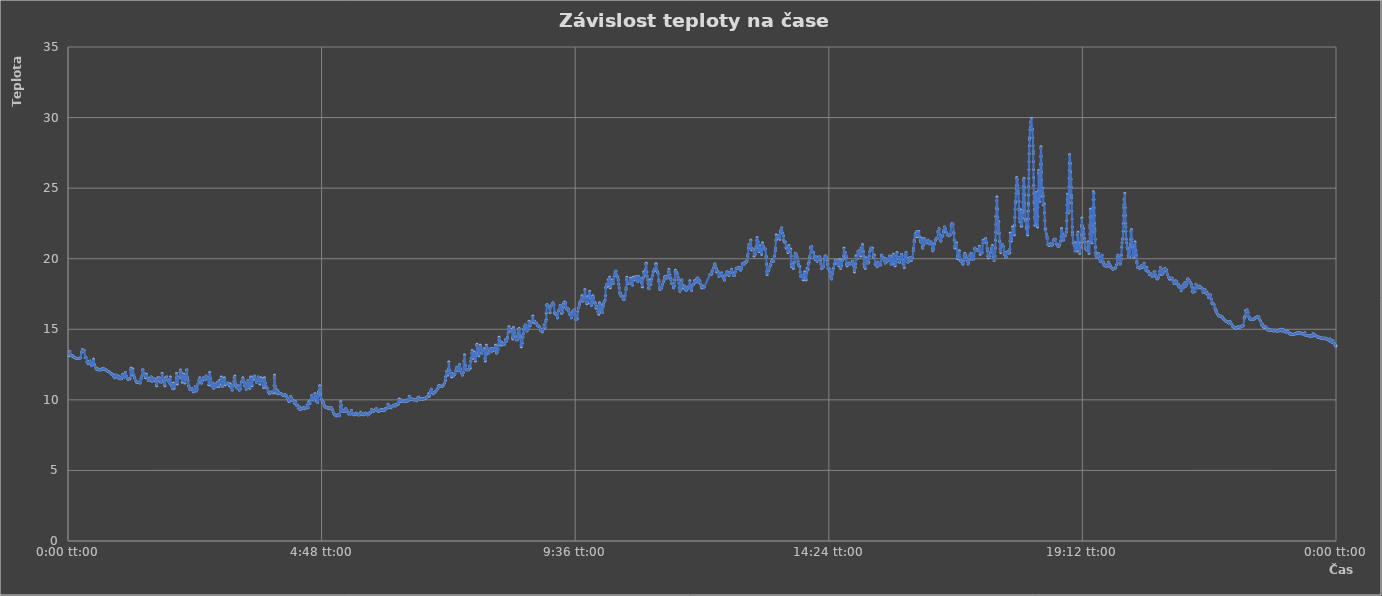
| Category | teplota |
|---|---|
| 0.000636574074074074 | 13.125 |
| 0.0013541666666666667 | 13.438 |
| 0.0020601851851851853 | 13.188 |
| 0.0028124999999999995 | 13.125 |
| 0.0035185185185185185 | 13.125 |
| 0.004236111111111111 | 13.062 |
| 0.004942129629629629 | 13 |
| 0.005659722222222222 | 13 |
| 0.00636574074074074 | 12.938 |
| 0.007083333333333333 | 12.938 |
| 0.0078009259259259256 | 12.938 |
| 0.008506944444444444 | 12.938 |
| 0.009224537037037036 | 12.938 |
| 0.009930555555555555 | 13 |
| 0.01064814814814815 | 13.375 |
| 0.011354166666666667 | 13.562 |
| 0.01207175925925926 | 13.438 |
| 0.012777777777777777 | 13.5 |
| 0.013587962962962963 | 13 |
| 0.014293981481481482 | 13 |
| 0.01511574074074074 | 12.688 |
| 0.015173611111111112 | 12.688 |
| 0.01587962962962963 | 12.562 |
| 0.01659722222222222 | 12.688 |
| 0.01730324074074074 | 12.75 |
| 0.018020833333333333 | 12.562 |
| 0.018726851851851852 | 12.438 |
| 0.019444444444444445 | 12.5 |
| 0.020150462962962964 | 12.875 |
| 0.020868055555555556 | 12.5 |
| 0.021574074074074075 | 12.312 |
| 0.022291666666666668 | 12.188 |
| 0.022997685185185187 | 12.188 |
| 0.023715277777777776 | 12.188 |
| 0.023877314814814813 | 12.125 |
| 0.024444444444444446 | 12.125 |
| 0.02515046296296296 | 12.125 |
| 0.025868055555555557 | 12.125 |
| 0.026574074074074073 | 12.188 |
| 0.027291666666666662 | 12.188 |
| 0.027997685185185184 | 12.188 |
| 0.02871527777777778 | 12.188 |
| 0.029421296296296296 | 12.125 |
| 0.030138888888888885 | 12.125 |
| 0.030844907407407404 | 12.062 |
| 0.0315625 | 12 |
| 0.03228009259259259 | 12 |
| 0.03298611111111111 | 11.938 |
| 0.0337037037037037 | 11.875 |
| 0.034409722222222223 | 11.812 |
| 0.03512731481481481 | 11.812 |
| 0.035833333333333335 | 11.688 |
| 0.036550925925925924 | 11.625 |
| 0.03699074074074074 | 11.562 |
| 0.037280092592592594 | 11.75 |
| 0.037986111111111116 | 11.75 |
| 0.038703703703703705 | 11.625 |
| 0.03940972222222222 | 11.688 |
| 0.04012731481481482 | 11.5 |
| 0.04083333333333333 | 11.625 |
| 0.041608796296296297 | 11.5 |
| 0.04232638888888889 | 11.5 |
| 0.043101851851851856 | 11.812 |
| 0.043819444444444446 | 11.625 |
| 0.04452546296296297 | 11.625 |
| 0.04524305555555556 | 11.938 |
| 0.04594907407407408 | 11.688 |
| 0.046863425925925926 | 11.5 |
| 0.047581018518518516 | 11.438 |
| 0.04828703703703704 | 11.5 |
| 0.04900462962962963 | 11.5 |
| 0.049479166666666664 | 12.125 |
| 0.0497337962962963 | 12.25 |
| 0.05043981481481482 | 11.75 |
| 0.05115740740740741 | 12.188 |
| 0.05186342592592593 | 11.75 |
| 0.052453703703703704 | 11.562 |
| 0.05259259259259259 | 11.562 |
| 0.05331018518518518 | 11.375 |
| 0.05401620370370371 | 11.25 |
| 0.054733796296296294 | 11.25 |
| 0.05543981481481481 | 11.25 |
| 0.056157407407407406 | 11.25 |
| 0.05686342592592592 | 11.188 |
| 0.05758101851851852 | 11.5 |
| 0.058298611111111114 | 11.688 |
| 0.05894675925925926 | 12.125 |
| 0.0590162037037037 | 12.125 |
| 0.0597337962962963 | 11.875 |
| 0.060439814814814814 | 11.812 |
| 0.06115740740740741 | 11.625 |
| 0.06116898148148148 | 11.562 |
| 0.06188657407407407 | 11.812 |
| 0.06259259259259259 | 11.562 |
| 0.06331018518518518 | 11.375 |
| 0.06422453703703704 | 11.375 |
| 0.06494212962962963 | 11.562 |
| 0.06564814814814814 | 11.625 |
| 0.06636574074074074 | 11.312 |
| 0.06707175925925926 | 11.375 |
| 0.06778935185185185 | 11.5 |
| 0.06849537037037036 | 11.438 |
| 0.06921296296296296 | 11.312 |
| 0.06991898148148147 | 11.062 |
| 0.06999999999999999 | 11 |
| 0.07064814814814814 | 11.375 |
| 0.07079861111111112 | 11.562 |
| 0.07137731481481481 | 11.375 |
| 0.07209490740740741 | 11.562 |
| 0.07280092592592592 | 11.25 |
| 0.07351851851851852 | 11.25 |
| 0.07422453703703703 | 11.875 |
| 0.07494212962962964 | 11.375 |
| 0.07564814814814814 | 11.25 |
| 0.07636574074074075 | 11.062 |
| 0.07644675925925926 | 11 |
| 0.07674768518518518 | 11.562 |
| 0.07710648148148148 | 11.438 |
| 0.07781249999999999 | 11.625 |
| 0.07858796296296296 | 11.438 |
| 0.07930555555555556 | 11.312 |
| 0.08002314814814815 | 11.188 |
| 0.08072916666666667 | 11.625 |
| 0.08144675925925926 | 11.062 |
| 0.08155092592592593 | 11 |
| 0.08229166666666667 | 10.812 |
| 0.08299768518518519 | 11.188 |
| 0.08371527777777778 | 10.812 |
| 0.08465277777777779 | 11.125 |
| 0.0853587962962963 | 11.562 |
| 0.08555555555555555 | 11.875 |
| 0.08626157407407407 | 11.125 |
| 0.08704861111111112 | 11.625 |
| 0.08775462962962964 | 11.562 |
| 0.08847222222222223 | 11.938 |
| 0.08877314814814814 | 12.125 |
| 0.08928240740740741 | 11.938 |
| 0.08951388888888889 | 11.562 |
| 0.09004629629629629 | 11.25 |
| 0.09079861111111111 | 11.625 |
| 0.09151620370370371 | 11.812 |
| 0.09222222222222222 | 11.188 |
| 0.09293981481481482 | 11.5 |
| 0.09359953703703704 | 12.125 |
| 0.09365740740740741 | 12.125 |
| 0.09424768518518518 | 11.562 |
| 0.09462962962962962 | 11.375 |
| 0.09521990740740742 | 11 |
| 0.09535879629629629 | 10.938 |
| 0.09606481481481481 | 10.75 |
| 0.09679398148148148 | 10.812 |
| 0.09749999999999999 | 10.812 |
| 0.09821759259259259 | 10.688 |
| 0.09893518518518518 | 10.562 |
| 0.0996412037037037 | 10.688 |
| 0.1003587962962963 | 10.938 |
| 0.10106481481481482 | 10.625 |
| 0.1017824074074074 | 10.75 |
| 0.10248842592592593 | 11.125 |
| 0.10320601851851852 | 11.375 |
| 0.10391203703703704 | 11.438 |
| 0.10399305555555556 | 11.562 |
| 0.10464120370370371 | 11.25 |
| 0.1053587962962963 | 11.188 |
| 0.10606481481481482 | 11.375 |
| 0.10678240740740741 | 11.562 |
| 0.10748842592592593 | 11.5 |
| 0.10820601851851852 | 11.438 |
| 0.10891203703703704 | 11.688 |
| 0.10962962962962963 | 11.562 |
| 0.11033564814814815 | 11.562 |
| 0.11105324074074074 | 11.062 |
| 0.11175925925925927 | 11.938 |
| 0.11247685185185186 | 11.5 |
| 0.11313657407407407 | 11 |
| 0.11340277777777778 | 11 |
| 0.11421296296296296 | 11.188 |
| 0.11493055555555555 | 10.812 |
| 0.11563657407407407 | 11 |
| 0.11653935185185187 | 11.125 |
| 0.11725694444444446 | 10.938 |
| 0.11809027777777777 | 11.25 |
| 0.11879629629629629 | 10.938 |
| 0.11951388888888888 | 11.375 |
| 0.1202199074074074 | 11.125 |
| 0.1208449074074074 | 11.562 |
| 0.12094907407407407 | 11.625 |
| 0.12155092592592592 | 11 |
| 0.12167824074074074 | 10.938 |
| 0.12253472222222223 | 11.25 |
| 0.12324074074074075 | 11.438 |
| 0.12331018518518518 | 11.562 |
| 0.12414351851851851 | 11.062 |
| 0.1248611111111111 | 11.188 |
| 0.12577546296296296 | 11.188 |
| 0.12649305555555554 | 11.125 |
| 0.12730324074074076 | 11.125 |
| 0.1273263888888889 | 11 |
| 0.1280324074074074 | 11.125 |
| 0.12875 | 10.875 |
| 0.1294560185185185 | 10.688 |
| 0.13017361111111111 | 11 |
| 0.13087962962962962 | 11.312 |
| 0.1310300925925926 | 11.562 |
| 0.1316087962962963 | 11.688 |
| 0.1323263888888889 | 11.125 |
| 0.13238425925925926 | 11 |
| 0.13304398148148147 | 10.875 |
| 0.13376157407407407 | 10.812 |
| 0.13446759259259258 | 11 |
| 0.13518518518518519 | 10.688 |
| 0.1359027777777778 | 10.75 |
| 0.1366087962962963 | 11.25 |
| 0.1373263888888889 | 11.312 |
| 0.13792824074074075 | 11.562 |
| 0.13804398148148148 | 11.438 |
| 0.13876157407407408 | 11.25 |
| 0.13925925925925928 | 11 |
| 0.13961805555555554 | 11.188 |
| 0.14050925925925925 | 10.75 |
| 0.14122685185185185 | 10.938 |
| 0.14193287037037036 | 11.375 |
| 0.14265046296296297 | 11.188 |
| 0.14335648148148147 | 10.812 |
| 0.14396990740740742 | 11.562 |
| 0.14423611111111112 | 11.625 |
| 0.14494212962962963 | 11.062 |
| 0.14510416666666667 | 11 |
| 0.1456712962962963 | 11.438 |
| 0.14574074074074075 | 11.562 |
| 0.14640046296296297 | 11.625 |
| 0.14710648148148148 | 11.688 |
| 0.14782407407407408 | 11.438 |
| 0.1485300925925926 | 11.25 |
| 0.1492476851851852 | 11.312 |
| 0.1499537037037037 | 11.625 |
| 0.1506712962962963 | 11.5 |
| 0.15138888888888888 | 11.125 |
| 0.15209490740740741 | 11.562 |
| 0.1528125 | 11.375 |
| 0.15351851851851853 | 11.5 |
| 0.15409722222222222 | 11 |
| 0.1542476851851852 | 10.875 |
| 0.1549537037037037 | 11.5 |
| 0.15497685185185187 | 11.562 |
| 0.15568287037037037 | 11.188 |
| 0.15582175925925926 | 11 |
| 0.15641203703703704 | 10.875 |
| 0.15711805555555555 | 10.812 |
| 0.15783564814814813 | 10.562 |
| 0.15855324074074076 | 10.562 |
| 0.15885416666666666 | 10.438 |
| 0.15927083333333333 | 10.5 |
| 0.1599884259259259 | 10.5 |
| 0.16069444444444445 | 10.562 |
| 0.16141203703703702 | 10.5 |
| 0.16212962962962962 | 10.5 |
| 0.16253472222222223 | 11 |
| 0.1627199074074074 | 11.562 |
| 0.1628587962962963 | 11.75 |
| 0.16333333333333333 | 11 |
| 0.16358796296296296 | 10.812 |
| 0.16430555555555557 | 10.5 |
| 0.16501157407407407 | 10.688 |
| 0.1654861111111111 | 10.438 |
| 0.16582175925925927 | 10.562 |
| 0.16653935185185184 | 10.5 |
| 0.16724537037037038 | 10.438 |
| 0.16796296296296298 | 10.438 |
| 0.16886574074074076 | 10.375 |
| 0.16957175925925927 | 10.312 |
| 0.17028935185185187 | 10.312 |
| 0.17121527777777779 | 10.375 |
| 0.1719328703703704 | 10.312 |
| 0.1726388888888889 | 10.188 |
| 0.1733564814814815 | 10.062 |
| 0.1740625 | 9.938 |
| 0.1743634259259259 | 9.875 |
| 0.17488425925925924 | 9.938 |
| 0.1756712962962963 | 10.25 |
| 0.1763773148148148 | 10.125 |
| 0.1770949074074074 | 9.938 |
| 0.1778125 | 9.938 |
| 0.17862268518518518 | 9.75 |
| 0.1794097222222222 | 9.875 |
| 0.18013888888888888 | 9.625 |
| 0.18085648148148148 | 9.625 |
| 0.1815625 | 9.438 |
| 0.18241898148148147 | 9.5 |
| 0.18291666666666664 | 9.312 |
| 0.18322916666666667 | 9.312 |
| 0.18395833333333333 | 9.375 |
| 0.18466435185185184 | 9.375 |
| 0.18538194444444445 | 9.438 |
| 0.18608796296296296 | 9.438 |
| 0.18680555555555556 | 9.375 |
| 0.18774305555555557 | 9.438 |
| 0.1886111111111111 | 9.625 |
| 0.18931712962962963 | 9.438 |
| 0.1900347222222222 | 9.812 |
| 0.19006944444444443 | 9.875 |
| 0.19076388888888887 | 9.75 |
| 0.1914699074074074 | 10 |
| 0.19218749999999998 | 10.312 |
| 0.19289351851851852 | 10.125 |
| 0.1936111111111111 | 10 |
| 0.19431712962962963 | 10 |
| 0.19475694444444444 | 10.438 |
| 0.19508101851851853 | 10.25 |
| 0.1958564814814815 | 10.188 |
| 0.19621527777777778 | 9.875 |
| 0.19680555555555557 | 9.812 |
| 0.19753472222222224 | 10.438 |
| 0.19756944444444446 | 10.562 |
| 0.19827546296296297 | 10.688 |
| 0.19847222222222224 | 11 |
| 0.1989699074074074 | 10.438 |
| 0.19908564814814814 | 10.312 |
| 0.19980324074074074 | 10.062 |
| 0.20050925925925925 | 9.938 |
| 0.2010300925925926 | 9.875 |
| 0.20123842592592592 | 9.812 |
| 0.20195601851851852 | 9.625 |
| 0.20266203703703703 | 9.5 |
| 0.20337962962962963 | 9.5 |
| 0.20409722222222224 | 9.438 |
| 0.20480324074074074 | 9.438 |
| 0.20552083333333335 | 9.375 |
| 0.20622685185185186 | 9.438 |
| 0.20694444444444446 | 9.375 |
| 0.20765046296296297 | 9.438 |
| 0.20831018518518518 | 9.312 |
| 0.20837962962962964 | 9.312 |
| 0.20909722222222224 | 9.125 |
| 0.20980324074074075 | 9 |
| 0.21052083333333335 | 8.938 |
| 0.21122685185185186 | 8.875 |
| 0.21194444444444446 | 8.875 |
| 0.21265046296296297 | 8.938 |
| 0.21336805555555557 | 8.938 |
| 0.21408564814814815 | 8.875 |
| 0.2147916666666667 | 9.5 |
| 0.21505787037037039 | 9.875 |
| 0.21552083333333336 | 9.625 |
| 0.21604166666666666 | 9.312 |
| 0.21625000000000003 | 9.188 |
| 0.2169675925925926 | 9.25 |
| 0.21768518518518518 | 9.188 |
| 0.21839120370370368 | 9.188 |
| 0.21910879629629632 | 9.375 |
| 0.21996527777777777 | 9.25 |
| 0.2206712962962963 | 9.125 |
| 0.22138888888888889 | 9 |
| 0.22209490740740742 | 9.062 |
| 0.2228125 | 9 |
| 0.22351851851851853 | 9.25 |
| 0.2242361111111111 | 9 |
| 0.22494212962962964 | 9 |
| 0.22565972222222222 | 8.938 |
| 0.22653935185185184 | 9 |
| 0.22724537037037038 | 9.062 |
| 0.22796296296296295 | 9 |
| 0.22868055555555555 | 8.938 |
| 0.22938657407407406 | 8.938 |
| 0.23010416666666667 | 8.938 |
| 0.23081018518518517 | 9.125 |
| 0.23152777777777778 | 9 |
| 0.23223379629629629 | 9 |
| 0.2330671296296296 | 8.938 |
| 0.23378472222222224 | 9 |
| 0.23449074074074075 | 9.062 |
| 0.23520833333333332 | 9 |
| 0.23592592592592596 | 8.938 |
| 0.23663194444444446 | 8.938 |
| 0.237349537037037 | 9.062 |
| 0.23805555555555555 | 9.062 |
| 0.23877314814814818 | 9.125 |
| 0.2394791666666667 | 9.312 |
| 0.24019675925925923 | 9.188 |
| 0.24100694444444445 | 9.188 |
| 0.24172453703703703 | 9.25 |
| 0.24243055555555557 | 9.312 |
| 0.24314814814814814 | 9.375 |
| 0.24386574074074074 | 9.25 |
| 0.24457175925925925 | 9.188 |
| 0.24528935185185186 | 9.188 |
| 0.24599537037037036 | 9.25 |
| 0.24673611111111113 | 9.312 |
| 0.24744212962962964 | 9.25 |
| 0.24815972222222224 | 9.312 |
| 0.24886574074074075 | 9.25 |
| 0.24958333333333335 | 9.25 |
| 0.25030092592592595 | 9.375 |
| 0.25100694444444444 | 9.375 |
| 0.25172453703703707 | 9.438 |
| 0.25243055555555555 | 9.688 |
| 0.2531481481481482 | 9.5 |
| 0.25385416666666666 | 9.5 |
| 0.2545717592592593 | 9.438 |
| 0.25527777777777777 | 9.5 |
| 0.2559953703703704 | 9.562 |
| 0.256712962962963 | 9.625 |
| 0.2574189814814815 | 9.625 |
| 0.2581365740740741 | 9.562 |
| 0.2588425925925926 | 9.688 |
| 0.25971064814814815 | 9.688 |
| 0.2604166666666667 | 9.688 |
| 0.2609837962962963 | 9.875 |
| 0.26114583333333335 | 10.062 |
| 0.26186342592592593 | 9.875 |
| 0.26256944444444447 | 10 |
| 0.26328703703703704 | 9.875 |
| 0.2639930555555556 | 9.875 |
| 0.26471064814814815 | 9.875 |
| 0.2654166666666667 | 9.938 |
| 0.26613425925925926 | 9.875 |
| 0.26685185185185184 | 9.875 |
| 0.2675578703703704 | 10 |
| 0.26841435185185186 | 9.938 |
| 0.26912037037037034 | 10.25 |
| 0.269837962962963 | 10.062 |
| 0.27054398148148145 | 10.062 |
| 0.2713541666666667 | 10.062 |
| 0.2720601851851852 | 10 |
| 0.2727777777777778 | 10 |
| 0.2734837962962963 | 10 |
| 0.2742013888888889 | 10 |
| 0.27490740740740743 | 9.938 |
| 0.27572916666666664 | 10.125 |
| 0.27644675925925927 | 10.188 |
| 0.27715277777777775 | 10.062 |
| 0.2778703703703704 | 10.062 |
| 0.27858796296296295 | 10.062 |
| 0.2792939814814815 | 10.062 |
| 0.28001157407407407 | 10.062 |
| 0.2807175925925926 | 10.062 |
| 0.2814351851851852 | 10.125 |
| 0.2821412037037037 | 10.125 |
| 0.2828587962962963 | 10.188 |
| 0.2835648148148148 | 10.25 |
| 0.2844675925925926 | 10.25 |
| 0.2845023148148148 | 10.438 |
| 0.28519675925925925 | 10.312 |
| 0.2859027777777778 | 10.625 |
| 0.28662037037037036 | 10.75 |
| 0.2873263888888889 | 10.5 |
| 0.28804398148148147 | 10.438 |
| 0.2887962962962963 | 10.5 |
| 0.2895138888888889 | 10.562 |
| 0.2902199074074074 | 10.625 |
| 0.291099537037037 | 10.75 |
| 0.29181712962962963 | 10.812 |
| 0.2924189814814815 | 11 |
| 0.2925462962962963 | 11 |
| 0.2932523148148148 | 11 |
| 0.29408564814814814 | 10.938 |
| 0.2947916666666667 | 10.938 |
| 0.29550925925925925 | 11 |
| 0.2962268518518519 | 11.062 |
| 0.29701388888888886 | 11.188 |
| 0.2977199074074074 | 11.375 |
| 0.29780092592592594 | 11.625 |
| 0.2986111111111111 | 12 |
| 0.29954861111111114 | 11.75 |
| 0.3001157407407407 | 12.188 |
| 0.30028935185185185 | 12.688 |
| 0.301099537037037 | 12.062 |
| 0.3019212962962963 | 11.875 |
| 0.3025347222222222 | 11.625 |
| 0.3029282407407407 | 11.875 |
| 0.30364583333333334 | 11.688 |
| 0.3043518518518518 | 11.75 |
| 0.3051273148148148 | 11.812 |
| 0.3058449074074074 | 12.062 |
| 0.30637731481481484 | 12.188 |
| 0.30667824074074074 | 12.312 |
| 0.30739583333333337 | 12.25 |
| 0.30810185185185185 | 12.062 |
| 0.30885416666666665 | 12.5 |
| 0.3095601851851852 | 12.188 |
| 0.31027777777777776 | 11.875 |
| 0.3110763888888889 | 11.75 |
| 0.3117824074074074 | 11.938 |
| 0.3122916666666667 | 12.75 |
| 0.3127314814814815 | 13.188 |
| 0.3134375 | 12.438 |
| 0.31376157407407407 | 12.188 |
| 0.31416666666666665 | 12.125 |
| 0.31506944444444446 | 12.125 |
| 0.3158564814814815 | 12.125 |
| 0.31657407407407406 | 12.375 |
| 0.3172800925925926 | 12.25 |
| 0.3176967592592593 | 12.75 |
| 0.31800925925925927 | 12.938 |
| 0.3185648148148148 | 13.312 |
| 0.31873842592592594 | 13.5 |
| 0.3196412037037037 | 12.938 |
| 0.3203472222222222 | 13.375 |
| 0.3210648148148148 | 13.062 |
| 0.32133101851851853 | 12.75 |
| 0.32178240740740743 | 13.188 |
| 0.3221527777777778 | 13.312 |
| 0.32244212962962965 | 13.875 |
| 0.32256944444444446 | 13.938 |
| 0.32328703703703704 | 13.625 |
| 0.3237152777777778 | 13.312 |
| 0.3240162037037037 | 13.125 |
| 0.3248263888888889 | 13.625 |
| 0.32511574074074073 | 13.875 |
| 0.32555555555555554 | 13.75 |
| 0.3262615740740741 | 13.312 |
| 0.3262847222222222 | 13.312 |
| 0.32719907407407406 | 13.5 |
| 0.32814814814814813 | 13.625 |
| 0.32885416666666667 | 12.938 |
| 0.32914351851851853 | 12.75 |
| 0.32958333333333334 | 13.188 |
| 0.3296064814814815 | 13.312 |
| 0.32993055555555556 | 13.875 |
| 0.3303935185185185 | 13.688 |
| 0.3305208333333333 | 13.312 |
| 0.3311226851851852 | 13.438 |
| 0.33184027777777775 | 13.312 |
| 0.3327199074074074 | 13.562 |
| 0.3334375 | 13.625 |
| 0.3341435185185185 | 13.438 |
| 0.3348611111111111 | 13.625 |
| 0.3355787037037037 | 13.5 |
| 0.3362847222222222 | 13.562 |
| 0.33700231481481485 | 13.688 |
| 0.33708333333333335 | 13.875 |
| 0.33771990740740737 | 13.5 |
| 0.3379861111111111 | 13.312 |
| 0.33844907407407404 | 13.375 |
| 0.33916666666666667 | 13.562 |
| 0.33945601851851853 | 13.875 |
| 0.33988425925925925 | 14.25 |
| 0.3399537037037037 | 14.438 |
| 0.3406134259259259 | 14.188 |
| 0.34133101851851855 | 14.062 |
| 0.34177083333333336 | 13.875 |
| 0.3420486111111111 | 14.062 |
| 0.34276620370370375 | 13.938 |
| 0.3434837962962963 | 14 |
| 0.3441898148148148 | 13.938 |
| 0.34490740740740744 | 14.25 |
| 0.345613425925926 | 14.125 |
| 0.3463310185185185 | 14.312 |
| 0.3465972222222222 | 14.438 |
| 0.3470486111111111 | 14.75 |
| 0.3476736111111111 | 15 |
| 0.3477777777777778 | 15.188 |
| 0.34849537037037037 | 14.875 |
| 0.3492013888888889 | 14.938 |
| 0.34991898148148143 | 15 |
| 0.35049768518518515 | 14.438 |
| 0.35063657407407406 | 14.312 |
| 0.3513078703703704 | 15 |
| 0.35136574074074073 | 15.125 |
| 0.3520833333333333 | 14.812 |
| 0.35278935185185184 | 14.5 |
| 0.3529166666666667 | 14.438 |
| 0.3535185185185185 | 14.25 |
| 0.35437500000000005 | 14.25 |
| 0.35508101851851853 | 14.688 |
| 0.3552662037037037 | 15 |
| 0.3558101851851852 | 15.062 |
| 0.3565509259259259 | 14.562 |
| 0.35662037037037037 | 14.438 |
| 0.35733796296296294 | 13.875 |
| 0.35747685185185185 | 13.75 |
| 0.3581828703703704 | 14 |
| 0.3587962962962963 | 14.438 |
| 0.3590625 | 14.688 |
| 0.3594212962962963 | 15 |
| 0.3599305555555556 | 15.188 |
| 0.36063657407407407 | 15.312 |
| 0.36135416666666664 | 15.125 |
| 0.3620601851851852 | 14.875 |
| 0.3627777777777778 | 15 |
| 0.36354166666666665 | 15.562 |
| 0.3637384259259259 | 15.25 |
| 0.36445601851851855 | 15.25 |
| 0.3651736111111111 | 15.438 |
| 0.3658796296296296 | 15.562 |
| 0.36658564814814815 | 15.938 |
| 0.3673032407407408 | 15.5 |
| 0.3680208333333333 | 15.562 |
| 0.36872685185185183 | 15.438 |
| 0.36944444444444446 | 15.438 |
| 0.370150462962963 | 15.25 |
| 0.3708680555555555 | 15.25 |
| 0.3717824074074074 | 15.188 |
| 0.3725347222222222 | 15 |
| 0.3726157407407407 | 14.938 |
| 0.37332175925925926 | 15 |
| 0.3740393518518519 | 14.812 |
| 0.37475694444444446 | 15 |
| 0.37546296296296294 | 15.312 |
| 0.3761805555555556 | 15.125 |
| 0.37680555555555556 | 15.562 |
| 0.3770949074074074 | 15.688 |
| 0.3771527777777777 | 16.125 |
| 0.3776157407407407 | 16.688 |
| 0.3778356481481482 | 16.75 |
| 0.37855324074074076 | 16.625 |
| 0.37942129629629634 | 16.562 |
| 0.3801273148148148 | 16.188 |
| 0.3808449074074074 | 16.625 |
| 0.381712962962963 | 16.75 |
| 0.38243055555555555 | 16.875 |
| 0.38313657407407403 | 16.75 |
| 0.38385416666666666 | 16.188 |
| 0.383900462962963 | 16.125 |
| 0.38457175925925924 | 16.062 |
| 0.38528935185185187 | 16.062 |
| 0.3859953703703704 | 15.812 |
| 0.38680555555555557 | 16.312 |
| 0.38751157407407405 | 16.438 |
| 0.3881365740740741 | 16.688 |
| 0.3882407407407407 | 16.688 |
| 0.38895833333333335 | 16.438 |
| 0.38925925925925925 | 16.125 |
| 0.38986111111111116 | 16.188 |
| 0.3907638888888889 | 16.562 |
| 0.39077546296296295 | 16.812 |
| 0.3916203703703704 | 16.938 |
| 0.3924652777777778 | 16.875 |
| 0.39326388888888886 | 16.438 |
| 0.3940277777777778 | 16.438 |
| 0.3947337962962963 | 16.438 |
| 0.3949768518518519 | 16.25 |
| 0.39556712962962964 | 16.062 |
| 0.3962847222222223 | 16.062 |
| 0.39699074074074076 | 15.812 |
| 0.39770833333333333 | 16.188 |
| 0.39841435185185187 | 16.312 |
| 0.3991319444444445 | 16.375 |
| 0.399837962962963 | 16 |
| 0.40047453703703706 | 15.688 |
| 0.4007986111111111 | 15.688 |
| 0.4016203703703704 | 15.75 |
| 0.402037037037037 | 16.25 |
| 0.40238425925925925 | 16.5 |
| 0.4031018518518519 | 16.688 |
| 0.4034143518518518 | 16.812 |
| 0.4039351851851852 | 16.938 |
| 0.40471064814814817 | 17.062 |
| 0.4052893518518519 | 17.375 |
| 0.40552083333333333 | 17.25 |
| 0.40622685185185187 | 17 |
| 0.4069444444444445 | 17.25 |
| 0.407650462962963 | 17.812 |
| 0.40836805555555555 | 17.312 |
| 0.4091898148148148 | 16.938 |
| 0.40925925925925927 | 16.812 |
| 0.4099189814814815 | 16.875 |
| 0.410625 | 17.312 |
| 0.41063657407407406 | 17.375 |
| 0.4113541666666667 | 17.688 |
| 0.4120601851851852 | 17.188 |
| 0.41239583333333335 | 16.812 |
| 0.4127893518518519 | 16.688 |
| 0.4134953703703704 | 17 |
| 0.41387731481481477 | 17.375 |
| 0.41422453703703704 | 17.25 |
| 0.4149421296296296 | 16.938 |
| 0.41564814814814816 | 16.875 |
| 0.4156828703703704 | 16.812 |
| 0.4163773148148148 | 16.5 |
| 0.4170833333333333 | 16.625 |
| 0.41780092592592594 | 16.5 |
| 0.4179629629629629 | 16.25 |
| 0.4185300925925926 | 16.062 |
| 0.419212962962963 | 16.812 |
| 0.4192476851851852 | 16.875 |
| 0.4199652777777778 | 16.75 |
| 0.42061342592592593 | 16.25 |
| 0.4206944444444444 | 16.188 |
| 0.421400462962963 | 16.188 |
| 0.42211805555555554 | 16.625 |
| 0.4223148148148148 | 16.812 |
| 0.4228356481481481 | 16.938 |
| 0.42355324074074074 | 17.062 |
| 0.4238888888888889 | 17.375 |
| 0.42416666666666664 | 17.938 |
| 0.42429398148148145 | 18 |
| 0.425 | 18.188 |
| 0.4257175925925926 | 18.062 |
| 0.4260300925925926 | 18.5 |
| 0.4264467592592593 | 18.375 |
| 0.42715277777777777 | 18.688 |
| 0.4276851851851852 | 17.938 |
| 0.42788194444444444 | 18.125 |
| 0.428587962962963 | 18.25 |
| 0.4287384259259259 | 18.5 |
| 0.42931712962962965 | 18.375 |
| 0.4300347222222222 | 18.25 |
| 0.4307407407407407 | 18.75 |
| 0.43145833333333333 | 18.938 |
| 0.43157407407407405 | 19.062 |
| 0.4321759259259259 | 19.125 |
| 0.43289351851851854 | 18.812 |
| 0.4335995370370371 | 18.688 |
| 0.43388888888888894 | 18.5 |
| 0.43432870370370374 | 18.188 |
| 0.4346643518518518 | 17.938 |
| 0.4350578703703704 | 17.562 |
| 0.4357638888888889 | 17.562 |
| 0.43615740740740744 | 17.375 |
| 0.43649305555555556 | 17.375 |
| 0.43721064814814814 | 17.312 |
| 0.4379166666666667 | 17.125 |
| 0.4386342592592593 | 17.125 |
| 0.4393402777777778 | 17.375 |
| 0.44005787037037036 | 17.812 |
| 0.440162037037037 | 17.938 |
| 0.4406481481481481 | 18.5 |
| 0.4407986111111111 | 18.688 |
| 0.44150462962962966 | 18.25 |
| 0.44222222222222224 | 18.25 |
| 0.4429282407407407 | 18.25 |
| 0.44364583333333335 | 18.625 |
| 0.4443518518518519 | 18.25 |
| 0.44506944444444446 | 18.125 |
| 0.44577546296296294 | 18.688 |
| 0.4464930555555556 | 18.5 |
| 0.4471990740740741 | 18.562 |
| 0.4479166666666667 | 18.75 |
| 0.44862268518518517 | 18.562 |
| 0.44934027777777774 | 18.375 |
| 0.45004629629629633 | 18.75 |
| 0.4507638888888889 | 18.5 |
| 0.4514699074074074 | 18.625 |
| 0.45218749999999996 | 18.312 |
| 0.4528935185185185 | 18 |
| 0.45361111111111113 | 18.625 |
| 0.45405092592592594 | 19.062 |
| 0.4545601851851852 | 18.812 |
| 0.4552777777777777 | 19.188 |
| 0.4558101851851852 | 19.625 |
| 0.4560069444444444 | 19.688 |
| 0.45643518518518517 | 19.062 |
| 0.456724537037037 | 18.75 |
| 0.45716435185185184 | 18.5 |
| 0.4574537037037037 | 18.25 |
| 0.45784722222222224 | 17.938 |
| 0.45818287037037037 | 17.875 |
| 0.4588888888888889 | 18.25 |
| 0.4590972222222222 | 18.5 |
| 0.45961805555555557 | 18.188 |
| 0.46033564814814815 | 18.562 |
| 0.4610416666666666 | 18.812 |
| 0.46142361111111113 | 19.062 |
| 0.4617708333333333 | 19.125 |
| 0.46247685185185183 | 19.25 |
| 0.46319444444444446 | 19.188 |
| 0.46350694444444446 | 19.625 |
| 0.46391203703703704 | 19.625 |
| 0.46462962962962967 | 19.125 |
| 0.46474537037037034 | 19.062 |
| 0.46535879629629634 | 18.938 |
| 0.4659259259259259 | 18.5 |
| 0.46607638888888886 | 18.375 |
| 0.4665972222222223 | 17.938 |
| 0.46680555555555553 | 17.812 |
| 0.46752314814814816 | 17.938 |
| 0.4682291666666667 | 17.938 |
| 0.46893518518518523 | 18.188 |
| 0.46965277777777775 | 18.375 |
| 0.47012731481481485 | 18.5 |
| 0.4703819444444444 | 18.688 |
| 0.47108796296296296 | 18.75 |
| 0.4718055555555556 | 18.688 |
| 0.4725115740740741 | 18.625 |
| 0.47322916666666665 | 18.812 |
| 0.4737384259259259 | 19.062 |
| 0.4739467592592593 | 19.25 |
| 0.47466435185185185 | 18.875 |
| 0.4753703703703704 | 18.625 |
| 0.4755671296296296 | 18.5 |
| 0.47609953703703706 | 18.25 |
| 0.4768171296296296 | 18.25 |
| 0.4775231481481481 | 18 |
| 0.4776157407407407 | 17.938 |
| 0.4782523148148148 | 18.062 |
| 0.47855324074074074 | 18.5 |
| 0.47879629629629633 | 19.062 |
| 0.47899305555555555 | 19.188 |
| 0.4796990740740741 | 19.062 |
| 0.48041666666666666 | 18.938 |
| 0.48112268518518514 | 18.688 |
| 0.48126157407407405 | 18.5 |
| 0.4818518518518518 | 18.25 |
| 0.4820717592592592 | 17.938 |
| 0.4825810185185185 | 17.688 |
| 0.483287037037037 | 17.812 |
| 0.48400462962962965 | 18.438 |
| 0.4840740740740741 | 18.5 |
| 0.4847337962962963 | 18.125 |
| 0.48483796296296294 | 17.938 |
| 0.4854513888888889 | 17.938 |
| 0.4861689814814815 | 18.062 |
| 0.486875 | 17.812 |
| 0.4875925925925926 | 17.75 |
| 0.4882986111111111 | 17.938 |
| 0.48901620370370374 | 17.875 |
| 0.4897222222222222 | 18.062 |
| 0.4904398148148148 | 18.438 |
| 0.49114583333333334 | 18 |
| 0.49186342592592597 | 17.75 |
| 0.49256944444444445 | 18.125 |
| 0.493287037037037 | 18.188 |
| 0.49399305555555556 | 18.438 |
| 0.4947106481481482 | 18.312 |
| 0.49541666666666667 | 18.438 |
| 0.49570601851851853 | 18.5 |
| 0.49614583333333334 | 18.625 |
| 0.4968518518518519 | 18.625 |
| 0.49756944444444445 | 18.312 |
| 0.49827546296296293 | 18.438 |
| 0.49899305555555556 | 18.188 |
| 0.4996990740740741 | 18.062 |
| 0.4998263888888889 | 17.938 |
| 0.5004282407407408 | 18.062 |
| 0.5011458333333333 | 17.938 |
| 0.5018518518518519 | 18 |
| 0.506261574074074 | 18.875 |
| 0.5069791666666666 | 18.875 |
| 0.5076851851851852 | 18.938 |
| 0.5078703703703703 | 19.062 |
| 0.5084143518518519 | 19.188 |
| 0.5091319444444444 | 19.375 |
| 0.5098379629629629 | 19.562 |
| 0.5101041666666667 | 19.625 |
| 0.5105671296296296 | 19.5 |
| 0.5112731481481482 | 19.312 |
| 0.511550925925926 | 19.062 |
| 0.5120023148148148 | 19.125 |
| 0.5127083333333333 | 19.062 |
| 0.513425925925926 | 18.75 |
| 0.5141319444444444 | 18.812 |
| 0.5148495370370371 | 18.938 |
| 0.5155671296296297 | 19 |
| 0.5162731481481482 | 18.75 |
| 0.5169791666666667 | 18.625 |
| 0.5176620370370371 | 18.5 |
| 0.5177083333333333 | 18.5 |
| 0.518425925925926 | 18.812 |
| 0.5191319444444444 | 18.875 |
| 0.5196759259259259 | 19.062 |
| 0.5198611111111111 | 19.062 |
| 0.5205671296296296 | 18.938 |
| 0.5212847222222222 | 18.812 |
| 0.5219907407407408 | 19 |
| 0.5227083333333333 | 19.062 |
| 0.5234143518518518 | 19.25 |
| 0.5241319444444444 | 19 |
| 0.524837962962963 | 18.812 |
| 0.5255555555555556 | 18.812 |
| 0.526261574074074 | 19.062 |
| 0.5269791666666667 | 19.312 |
| 0.5276851851851853 | 19.312 |
| 0.5284027777777778 | 19.375 |
| 0.5291087962962963 | 19.312 |
| 0.5298263888888889 | 19.375 |
| 0.5305324074074075 | 19.188 |
| 0.53125 | 19.312 |
| 0.5319328703703704 | 19.625 |
| 0.5319675925925925 | 19.625 |
| 0.5326851851851852 | 19.688 |
| 0.5333912037037037 | 19.625 |
| 0.5341087962962963 | 19.75 |
| 0.5348263888888889 | 19.75 |
| 0.5355324074074074 | 19.875 |
| 0.5360069444444444 | 20.188 |
| 0.536261574074074 | 20.312 |
| 0.5365740740740741 | 20.75 |
| 0.5369907407407407 | 21 |
| 0.5376967592592593 | 20.812 |
| 0.5384027777777778 | 21.312 |
| 0.538425925925926 | 21.312 |
| 0.5387384259259259 | 20.75 |
| 0.5391550925925926 | 20.625 |
| 0.5398611111111111 | 20.688 |
| 0.5405787037037036 | 20.625 |
| 0.5410416666666666 | 20.188 |
| 0.5412962962962963 | 20.25 |
| 0.5420138888888889 | 20.312 |
| 0.5425347222222222 | 20.75 |
| 0.5427430555555556 | 20.875 |
| 0.5432175925925926 | 21.312 |
| 0.5434606481481482 | 21.5 |
| 0.5441782407407407 | 21.188 |
| 0.5444444444444444 | 20.75 |
| 0.5449074074074074 | 20.5 |
| 0.5456134259259259 | 20.938 |
| 0.5463310185185185 | 20.5 |
| 0.5470370370370371 | 20.312 |
| 0.5477546296296296 | 21.125 |
| 0.5484606481481481 | 20.875 |
| 0.5491782407407407 | 20.688 |
| 0.5498958333333334 | 20.688 |
| 0.5505324074074074 | 20.188 |
| 0.550613425925926 | 20.125 |
| 0.5509027777777779 | 19.625 |
| 0.5511805555555556 | 19.062 |
| 0.5513541666666667 | 18.875 |
| 0.5520717592592593 | 19.125 |
| 0.5527777777777778 | 19.188 |
| 0.5534953703703703 | 19.438 |
| 0.5541435185185185 | 19.625 |
| 0.554224537037037 | 19.562 |
| 0.5549305555555556 | 19.812 |
| 0.5556481481481481 | 19.938 |
| 0.5563541666666666 | 19.812 |
| 0.557025462962963 | 20.188 |
| 0.5570833333333333 | 20.188 |
| 0.5577893518518519 | 20.562 |
| 0.5578587962962963 | 20.75 |
| 0.5583680555555556 | 21.312 |
| 0.5585300925925926 | 21.688 |
| 0.5592476851851852 | 21.438 |
| 0.5599537037037037 | 21.625 |
| 0.5606712962962963 | 21.5 |
| 0.5613888888888888 | 21.375 |
| 0.561886574074074 | 21.875 |
| 0.5621064814814815 | 22 |
| 0.5628240740740741 | 22.188 |
| 0.5635300925925926 | 21.812 |
| 0.5642476851851852 | 21.625 |
| 0.5644212962962963 | 21.312 |
| 0.5649768518518519 | 21.188 |
| 0.5656828703703703 | 21.188 |
| 0.5663657407407408 | 20.75 |
| 0.566412037037037 | 20.812 |
| 0.5671180555555556 | 20.75 |
| 0.5678356481481481 | 20.438 |
| 0.5685532407407408 | 20.938 |
| 0.5692592592592592 | 20.562 |
| 0.5699652777777778 | 20.688 |
| 0.5702893518518518 | 20.188 |
| 0.5705787037037037 | 19.625 |
| 0.5707060185185185 | 19.438 |
| 0.5714236111111112 | 19.625 |
| 0.5721296296296297 | 19.312 |
| 0.5728472222222222 | 19.75 |
| 0.573275462962963 | 20.188 |
| 0.5735763888888888 | 20.375 |
| 0.5742824074074074 | 20.312 |
| 0.5750000000000001 | 20.125 |
| 0.5757060185185185 | 19.812 |
| 0.5758912037037037 | 19.625 |
| 0.5764351851851852 | 19.5 |
| 0.5771412037037037 | 19.438 |
| 0.5774074074074075 | 19.062 |
| 0.5778703703703704 | 18.75 |
| 0.578576388888889 | 18.812 |
| 0.5792939814814815 | 18.812 |
| 0.5796990740740741 | 18.5 |
| 0.5800231481481481 | 18.625 |
| 0.5807291666666666 | 18.938 |
| 0.5809143518518519 | 19.062 |
| 0.5814583333333333 | 18.688 |
| 0.5815972222222222 | 18.5 |
| 0.5821875 | 18.5 |
| 0.5827083333333333 | 19.062 |
| 0.5829050925925926 | 19.312 |
| 0.5836226851851852 | 19.25 |
| 0.5838541666666667 | 19.625 |
| 0.5843518518518519 | 19.75 |
| 0.5850578703703704 | 20.062 |
| 0.5851041666666666 | 20.188 |
| 0.5857407407407408 | 20.75 |
| 0.5857986111111111 | 20.812 |
| 0.5865162037037037 | 20.875 |
| 0.5872222222222222 | 20.438 |
| 0.5879398148148148 | 20.438 |
| 0.5884490740740741 | 20.188 |
| 0.5886574074074075 | 20.062 |
| 0.589375 | 19.938 |
| 0.5900810185185185 | 20.125 |
| 0.5907986111111111 | 19.812 |
| 0.5915046296296297 | 20.062 |
| 0.5922222222222222 | 20.125 |
| 0.5929282407407407 | 20.125 |
| 0.5936458333333333 | 19.875 |
| 0.59375 | 19.625 |
| 0.594363425925926 | 19.312 |
| 0.5950810185185186 | 19.375 |
| 0.5957870370370371 | 19.438 |
| 0.5965046296296296 | 20 |
| 0.5971990740740741 | 20.188 |
| 0.5972337962962962 | 20.188 |
| 0.5979398148148148 | 20.125 |
| 0.5986574074074075 | 19.875 |
| 0.5988194444444445 | 19.625 |
| 0.599375 | 19.312 |
| 0.6000925925925926 | 19.25 |
| 0.6008101851851851 | 19.25 |
| 0.6011574074074074 | 19.062 |
| 0.6015277777777778 | 18.75 |
| 0.6022453703703704 | 18.562 |
| 0.6029513888888889 | 18.938 |
| 0.6036689814814815 | 19.312 |
| 0.6043287037037037 | 19.625 |
| 0.6043981481481482 | 19.625 |
| 0.6051041666666667 | 19.875 |
| 0.6058101851851853 | 19.875 |
| 0.6065277777777778 | 19.688 |
| 0.6072337962962963 | 19.875 |
| 0.6079513888888889 | 19.5 |
| 0.6086574074074075 | 19.938 |
| 0.609375 | 19.312 |
| 0.6100810185185185 | 19.5 |
| 0.6107986111111111 | 19.875 |
| 0.6115046296296297 | 20 |
| 0.6116435185185185 | 20.188 |
| 0.6119212962962963 | 20.75 |
| 0.6122453703703704 | 20.438 |
| 0.6129629629629629 | 20.438 |
| 0.6136226851851853 | 20.188 |
| 0.6136921296296296 | 20.062 |
| 0.6140162037037037 | 19.625 |
| 0.6144097222222222 | 19.5 |
| 0.6151273148148148 | 19.625 |
| 0.6158333333333333 | 19.688 |
| 0.616550925925926 | 19.625 |
| 0.6172569444444445 | 19.688 |
| 0.617974537037037 | 19.688 |
| 0.6186805555555556 | 19.812 |
| 0.6193981481481482 | 19.5 |
| 0.6201041666666667 | 19.188 |
| 0.6202083333333334 | 19.062 |
| 0.6208333333333333 | 19.375 |
| 0.6210532407407408 | 19.625 |
| 0.6215277777777778 | 20.188 |
| 0.6215740740740741 | 20.188 |
| 0.6222916666666667 | 20 |
| 0.6229976851851852 | 20.5 |
| 0.6237152777777778 | 20.562 |
| 0.6244212962962963 | 20.312 |
| 0.6251388888888889 | 20.188 |
| 0.6255671296296296 | 20.75 |
| 0.6258680555555556 | 20.75 |
| 0.6265740740740741 | 21 |
| 0.6272916666666667 | 20.5 |
| 0.6274652777777777 | 20.188 |
| 0.6277314814814815 | 19.625 |
| 0.6280208333333334 | 19.438 |
| 0.628738425925926 | 19.312 |
| 0.6294444444444445 | 20.062 |
| 0.630162037037037 | 19.812 |
| 0.6308680555555556 | 19.688 |
| 0.6315856481481482 | 19.75 |
| 0.631875 | 20.188 |
| 0.6323148148148149 | 20.5 |
| 0.6330208333333334 | 20.625 |
| 0.6332523148148148 | 20.75 |
| 0.63375 | 20.75 |
| 0.6344560185185185 | 20.75 |
| 0.6349768518518518 | 20.188 |
| 0.6351851851851852 | 20.125 |
| 0.6359027777777778 | 20.25 |
| 0.6366087962962963 | 19.625 |
| 0.6366203703703703 | 19.625 |
| 0.637337962962963 | 19.625 |
| 0.6380439814814814 | 19.438 |
| 0.6387615740740741 | 19.75 |
| 0.6394675925925926 | 19.562 |
| 0.6401851851851852 | 19.562 |
| 0.6408912037037037 | 19.562 |
| 0.6415509259259259 | 20.188 |
| 0.6416203703703703 | 20.25 |
| 0.6423263888888889 | 20.125 |
| 0.6430439814814815 | 20.062 |
| 0.6437499999999999 | 19.875 |
| 0.6444675925925926 | 19.688 |
| 0.6451736111111112 | 20 |
| 0.6458912037037037 | 19.812 |
| 0.6465972222222222 | 19.938 |
| 0.6473148148148148 | 19.875 |
| 0.6480208333333334 | 20.188 |
| 0.6487384259259259 | 19.938 |
| 0.6490972222222222 | 19.625 |
| 0.6494675925925926 | 19.625 |
| 0.650173611111111 | 20.125 |
| 0.6501851851851852 | 20.188 |
| 0.6509027777777777 | 20.312 |
| 0.6516087962962963 | 19.812 |
| 0.651724537037037 | 19.625 |
| 0.652337962962963 | 19.5 |
| 0.6530439814814815 | 19.75 |
| 0.6535185185185185 | 20.188 |
| 0.6537731481481481 | 20.438 |
| 0.6544907407407408 | 20 |
| 0.6551967592592592 | 20.062 |
| 0.6559143518518519 | 19.75 |
| 0.6566203703703704 | 20.062 |
| 0.657337962962963 | 20.312 |
| 0.6580439814814815 | 19.938 |
| 0.6587615740740741 | 19.688 |
| 0.6587731481481481 | 19.625 |
| 0.6594791666666667 | 19.375 |
| 0.660150462962963 | 20.188 |
| 0.6602083333333334 | 20.25 |
| 0.6609259259259259 | 20.438 |
| 0.6616319444444444 | 20.062 |
| 0.662349537037037 | 19.75 |
| 0.6630555555555556 | 19.812 |
| 0.6637731481481481 | 20.062 |
| 0.6644791666666666 | 20.062 |
| 0.6651851851851852 | 19.875 |
| 0.6659027777777778 | 20.062 |
| 0.6666087962962963 | 20.562 |
| 0.6668055555555555 | 20.75 |
| 0.667337962962963 | 21.188 |
| 0.6674305555555556 | 21.312 |
| 0.6680671296296296 | 21.75 |
| 0.6687847222222222 | 21.562 |
| 0.6691203703703703 | 21.875 |
| 0.6695023148148148 | 21.938 |
| 0.6702199074074073 | 21.562 |
| 0.670925925925926 | 21.938 |
| 0.6716435185185184 | 21.562 |
| 0.6721180555555555 | 21.312 |
| 0.6723611111111111 | 21.188 |
| 0.6730787037037037 | 21.438 |
| 0.6737962962962962 | 20.875 |
| 0.674074074074074 | 20.75 |
| 0.6745138888888889 | 20.938 |
| 0.6749884259259259 | 21.312 |
| 0.6752430555555556 | 21.438 |
| 0.6760185185185185 | 21.125 |
| 0.6768055555555555 | 21.125 |
| 0.6775578703703703 | 21.25 |
| 0.6782638888888889 | 21.312 |
| 0.6789930555555556 | 21.062 |
| 0.6797222222222222 | 21.062 |
| 0.6804282407407407 | 21.188 |
| 0.6811458333333333 | 21.125 |
| 0.6817129629629629 | 20.75 |
| 0.6819791666666667 | 20.562 |
| 0.6826851851851852 | 20.688 |
| 0.6834027777777778 | 21.062 |
| 0.6840856481481481 | 21.312 |
| 0.6841319444444444 | 21.312 |
| 0.684837962962963 | 21.438 |
| 0.6855555555555556 | 21.438 |
| 0.6861574074074074 | 21.875 |
| 0.6862731481481482 | 21.938 |
| 0.6869907407407408 | 22.125 |
| 0.6876967592592593 | 21.688 |
| 0.6882407407407407 | 21.312 |
| 0.6884259259259259 | 21.25 |
| 0.6891435185185185 | 21.562 |
| 0.6898495370370371 | 21.625 |
| 0.690462962962963 | 21.875 |
| 0.6905787037037037 | 22 |
| 0.6912847222222221 | 22.25 |
| 0.6920023148148148 | 22.125 |
| 0.6927199074074074 | 21.875 |
| 0.693425925925926 | 21.688 |
| 0.694212962962963 | 21.688 |
| 0.6949305555555556 | 21.625 |
| 0.695787037037037 | 21.688 |
| 0.6965046296296297 | 22.312 |
| 0.6969791666666666 | 22.438 |
| 0.6972337962962962 | 22.5 |
| 0.6979398148148147 | 22.438 |
| 0.6985648148148148 | 21.875 |
| 0.6986689814814815 | 21.75 |
| 0.6989467592592593 | 21.312 |
| 0.699398148148148 | 20.875 |
| 0.6995486111111111 | 20.75 |
| 0.7001157407407407 | 20.938 |
| 0.7008333333333333 | 21.125 |
| 0.701400462962963 | 20.188 |
| 0.7015625 | 20 |
| 0.7022685185185185 | 20.25 |
| 0.7029861111111111 | 20.562 |
| 0.7036921296296296 | 19.875 |
| 0.7044097222222222 | 19.812 |
| 0.7051157407407408 | 19.812 |
| 0.7057638888888889 | 19.625 |
| 0.7058449074074074 | 19.625 |
| 0.7065625 | 19.875 |
| 0.7067476851851852 | 20.188 |
| 0.7072800925925926 | 20.375 |
| 0.7079976851851852 | 20.25 |
| 0.7087037037037037 | 20.062 |
| 0.7094212962962962 | 19.812 |
| 0.7098726851851852 | 19.625 |
| 0.710150462962963 | 19.75 |
| 0.7108564814814815 | 19.938 |
| 0.7113078703703705 | 20.188 |
| 0.7115856481481481 | 20.312 |
| 0.7122916666666667 | 20.375 |
| 0.7130092592592593 | 20.25 |
| 0.7137152777777778 | 19.938 |
| 0.7144328703703704 | 20 |
| 0.7151388888888889 | 20.688 |
| 0.7152314814814815 | 20.75 |
| 0.7158680555555555 | 20.625 |
| 0.716574074074074 | 20.625 |
| 0.7172916666666667 | 20.625 |
| 0.7180092592592593 | 20.562 |
| 0.7187152777777778 | 20.875 |
| 0.7194328703703704 | 20.312 |
| 0.720138888888889 | 20.375 |
| 0.7208564814814814 | 20.438 |
| 0.7215625 | 21.125 |
| 0.721712962962963 | 21.312 |
| 0.7222916666666667 | 21.312 |
| 0.7230092592592593 | 21.188 |
| 0.7237152777777777 | 21.438 |
| 0.7244328703703703 | 21.125 |
| 0.7248958333333334 | 20.75 |
| 0.7251504629629629 | 20.562 |
| 0.7254166666666667 | 20.188 |
| 0.7258796296296296 | 20.062 |
| 0.7267939814814816 | 20.188 |
| 0.727511574074074 | 20.438 |
| 0.7282175925925927 | 20.625 |
| 0.7284837962962962 | 20.75 |
| 0.7289467592592592 | 20.938 |
| 0.7296064814814814 | 20.188 |
| 0.7296759259259259 | 20.125 |
| 0.7303819444444444 | 19.875 |
| 0.731099537037037 | 20.188 |
| 0.7314004629629629 | 20.75 |
| 0.7314930555555555 | 21.312 |
| 0.7315972222222222 | 21.875 |
| 0.731712962962963 | 22.438 |
| 0.7318402777777777 | 23 |
| 0.731875 | 23 |
| 0.732175925925926 | 23.562 |
| 0.7324999999999999 | 24.125 |
| 0.7326157407407408 | 24.375 |
| 0.7330555555555556 | 23.5 |
| 0.7331712962962963 | 22.938 |
| 0.733275462962963 | 22.375 |
| 0.7333680555555556 | 21.938 |
| 0.7333912037037037 | 21.812 |
| 0.733912037037037 | 22.375 |
| 0.7341087962962963 | 22.625 |
| 0.7344444444444443 | 21.812 |
| 0.7348032407407407 | 21.25 |
| 0.734849537037037 | 21.188 |
| 0.7352430555555555 | 20.688 |
| 0.7355787037037037 | 20.438 |
| 0.7362847222222223 | 20.938 |
| 0.7370023148148147 | 21 |
| 0.7377199074074073 | 20.875 |
| 0.7384259259259259 | 20.312 |
| 0.7391435185185186 | 20.438 |
| 0.7395949074074074 | 20.125 |
| 0.7398611111111112 | 20.125 |
| 0.7405787037037036 | 20.438 |
| 0.7412847222222222 | 20.5 |
| 0.7420023148148148 | 20.375 |
| 0.7427083333333333 | 20.438 |
| 0.742800925925926 | 20.688 |
| 0.7429282407407407 | 21.25 |
| 0.7430092592592592 | 21.812 |
| 0.7434606481481482 | 21.625 |
| 0.7439699074074074 | 21.25 |
| 0.7441898148148148 | 21.438 |
| 0.7446990740740741 | 21.812 |
| 0.7449189814814815 | 22.25 |
| 0.745625 | 21.75 |
| 0.7463425925925926 | 21.688 |
| 0.7465972222222222 | 22.375 |
| 0.7467013888888889 | 22.938 |
| 0.7468634259259259 | 23.5 |
| 0.7470949074074075 | 23.938 |
| 0.7471875 | 24.062 |
| 0.7476851851851851 | 24.625 |
| 0.7478356481481482 | 24.938 |
| 0.7479050925925925 | 25.188 |
| 0.7480902777777777 | 25.75 |
| 0.7485763888888889 | 25.625 |
| 0.7490740740740741 | 25.188 |
| 0.7493055555555556 | 24.812 |
| 0.749375 | 24.625 |
| 0.7499189814814815 | 24.062 |
| 0.7500347222222222 | 23.562 |
| 0.7500578703703704 | 23.438 |
| 0.7502546296296296 | 22.875 |
| 0.7507754629629629 | 22.625 |
| 0.7513078703703703 | 23.438 |
| 0.7515046296296296 | 22.938 |
| 0.7515162037037038 | 22.875 |
| 0.7516666666666666 | 22.312 |
| 0.7522453703703703 | 22.312 |
| 0.752800925925926 | 22.875 |
| 0.7529745370370371 | 23.25 |
| 0.7530208333333334 | 23.438 |
| 0.7531365740740741 | 24 |
| 0.7532523148148148 | 24.562 |
| 0.7533912037037037 | 25.125 |
| 0.7537384259259259 | 25.562 |
| 0.7539583333333333 | 25.688 |
| 0.7543634259259259 | 25.062 |
| 0.7544791666666667 | 24.562 |
| 0.7544907407407407 | 24.5 |
| 0.7546064814814816 | 23.938 |
| 0.7548032407407407 | 23.375 |
| 0.7550925925925926 | 22.812 |
| 0.7552546296296296 | 22.688 |
| 0.7557986111111111 | 22.25 |
| 0.7559722222222223 | 22.125 |
| 0.7566898148148148 | 21.812 |
| 0.7568287037037037 | 21.688 |
| 0.7572106481481482 | 22.25 |
| 0.7573263888888889 | 22.812 |
| 0.7574074074074074 | 23.375 |
| 0.7574537037037037 | 23.812 |
| 0.7574652777777778 | 23.938 |
| 0.7575462962962963 | 24.5 |
| 0.757650462962963 | 25.125 |
| 0.7577314814814815 | 25.688 |
| 0.7578587962962963 | 26.312 |
| 0.7579398148148148 | 26.875 |
| 0.7580324074074074 | 27.438 |
| 0.7581597222222222 | 28 |
| 0.758287037037037 | 28.438 |
| 0.7583333333333333 | 28.562 |
| 0.7586805555555555 | 29.125 |
| 0.7590162037037037 | 29.312 |
| 0.7591550925925926 | 29.688 |
| 0.7597453703703704 | 29.938 |
| 0.7603472222222223 | 29.125 |
| 0.760474537037037 | 29.188 |
| 0.7609374999999999 | 28.562 |
| 0.7610763888888888 | 28 |
| 0.7612152777777778 | 27.625 |
| 0.76125 | 27.438 |
| 0.7613425925925926 | 26.875 |
| 0.7614351851851852 | 26.312 |
| 0.761539351851852 | 25.75 |
| 0.7616203703703704 | 25.188 |
| 0.7617361111111111 | 24.625 |
| 0.7619212962962963 | 24.062 |
| 0.762025462962963 | 23.938 |
| 0.7621875 | 23.5 |
| 0.762349537037037 | 22.938 |
| 0.7625694444444444 | 22.375 |
| 0.7627777777777777 | 22.75 |
| 0.762800925925926 | 22.938 |
| 0.7629050925925926 | 23.562 |
| 0.7630092592592592 | 24.125 |
| 0.7633217592592593 | 24.688 |
| 0.7637037037037038 | 24.125 |
| 0.7637499999999999 | 24 |
| 0.7638773148148149 | 23.562 |
| 0.764074074074074 | 23 |
| 0.7643402777777778 | 22.438 |
| 0.7646064814814815 | 22.25 |
| 0.7647916666666666 | 23 |
| 0.7649074074074074 | 23.625 |
| 0.765011574074074 | 24.25 |
| 0.7653240740740741 | 24.812 |
| 0.7653472222222222 | 26.062 |
| 0.7656018518518519 | 26.25 |
| 0.7661226851851852 | 25.5 |
| 0.7661342592592592 | 24.812 |
| 0.7662962962962964 | 24.25 |
| 0.7665162037037038 | 24.062 |
| 0.7666898148148148 | 24.875 |
| 0.7667824074074074 | 25.5 |
| 0.7668981481481482 | 26.125 |
| 0.7669907407407407 | 26.688 |
| 0.7671875 | 27.25 |
| 0.7672800925925927 | 27.812 |
| 0.7673148148148149 | 27.938 |
| 0.7675925925925925 | 27.25 |
| 0.7676851851851851 | 26.688 |
| 0.7677777777777778 | 26.125 |
| 0.7678587962962963 | 25.562 |
| 0.7679745370370371 | 25 |
| 0.7681018518518519 | 24.562 |
| 0.7681481481481481 | 24.438 |
| 0.7686342592592593 | 25 |
| 0.7688425925925926 | 24.625 |
| 0.7691203703703704 | 24.438 |
| 0.7691319444444445 | 23.812 |
| 0.7700231481481481 | 23.875 |
| 0.7700694444444444 | 23.25 |
| 0.7703935185185186 | 22.688 |
| 0.7706944444444445 | 22.125 |
| 0.770775462962963 | 22.062 |
| 0.7714930555555556 | 21.75 |
| 0.772048611111111 | 21.562 |
| 0.7722106481481482 | 21.438 |
| 0.7729050925925925 | 21 |
| 0.7729398148148148 | 21 |
| 0.7736574074074074 | 20.938 |
| 0.7743634259259259 | 21 |
| 0.7750810185185185 | 21.062 |
| 0.7757870370370371 | 20.938 |
| 0.7765046296296297 | 21 |
| 0.7772106481481481 | 21.312 |
| 0.7779282407407407 | 21.375 |
| 0.7786342592592592 | 21.375 |
| 0.7793518518518519 | 21.062 |
| 0.7800578703703703 | 21 |
| 0.780775462962963 | 20.875 |
| 0.7814930555555556 | 20.875 |
| 0.782199074074074 | 21 |
| 0.7829166666666666 | 21.25 |
| 0.7832060185185186 | 21.562 |
| 0.7834722222222222 | 22.125 |
| 0.7836574074074073 | 22.125 |
| 0.7843634259259259 | 21.75 |
| 0.7845023148148148 | 21.562 |
| 0.7850925925925926 | 21.312 |
| 0.7857986111111112 | 21.625 |
| 0.7865162037037038 | 21.625 |
| 0.7872337962962962 | 21.875 |
| 0.7875810185185186 | 22.125 |
| 0.7876967592592593 | 22.688 |
| 0.7877777777777778 | 23.25 |
| 0.7878935185185186 | 23.812 |
| 0.7882291666666666 | 24.188 |
| 0.7882407407407408 | 24.562 |
| 0.7886805555555556 | 24 |
| 0.7888773148148148 | 23.438 |
| 0.7889814814814815 | 23.25 |
| 0.7892939814814816 | 24 |
| 0.7893981481481481 | 24.562 |
| 0.7894791666666667 | 25.125 |
| 0.7895717592592592 | 25.688 |
| 0.789675925925926 | 26.25 |
| 0.7897685185185185 | 26.75 |
| 0.7897800925925926 | 26.812 |
| 0.7899074074074074 | 27.375 |
| 0.7905555555555556 | 26.75 |
| 0.7905902777777777 | 26.188 |
| 0.790625 | 26.125 |
| 0.7910879629629629 | 25.625 |
| 0.7911921296296297 | 25.062 |
| 0.7913310185185186 | 24.5 |
| 0.7913888888888888 | 24.312 |
| 0.7914699074074073 | 23.938 |
| 0.7916319444444445 | 23.375 |
| 0.791863425925926 | 22.812 |
| 0.792025462962963 | 22.25 |
| 0.7921527777777778 | 21.875 |
| 0.7923032407407408 | 21.688 |
| 0.7927083333333332 | 21.125 |
| 0.7928935185185185 | 21.188 |
| 0.793599537037037 | 20.938 |
| 0.7942592592592592 | 20.562 |
| 0.7943287037037038 | 20.562 |
| 0.7950462962962962 | 21.062 |
| 0.7950578703703703 | 21.125 |
| 0.7956481481481482 | 20.562 |
| 0.7957870370370371 | 20.562 |
| 0.7960532407407408 | 21.125 |
| 0.7961574074074074 | 21.688 |
| 0.7965277777777778 | 21.875 |
| 0.7970717592592593 | 21.125 |
| 0.7972453703703705 | 21 |
| 0.7977662037037038 | 20.562 |
| 0.797974537037037 | 20.375 |
| 0.7986921296296297 | 20.812 |
| 0.7990393518518518 | 21.125 |
| 0.799212962962963 | 21.688 |
| 0.7993981481481481 | 22.25 |
| 0.7994444444444445 | 22.375 |
| 0.7995833333333334 | 22.875 |
| 0.7999768518518519 | 22.312 |
| 0.8001851851851852 | 21.938 |
| 0.8009027777777779 | 22.125 |
| 0.8011111111111111 | 21.75 |
| 0.8016203703703703 | 21.438 |
| 0.8018402777777779 | 21.188 |
| 0.802349537037037 | 20.75 |
| 0.8030671296296297 | 20.75 |
| 0.8035416666666667 | 20.625 |
| 0.8037847222222222 | 20.625 |
| 0.8045023148148148 | 21.062 |
| 0.804525462962963 | 21.188 |
| 0.8050347222222222 | 20.625 |
| 0.8052430555555555 | 20.375 |
| 0.8057986111111112 | 21.188 |
| 0.8059027777777777 | 21.75 |
| 0.8059837962962964 | 22.188 |
| 0.8060069444444444 | 22.375 |
| 0.8061226851851852 | 22.938 |
| 0.8062615740740741 | 23.5 |
| 0.8066087962962962 | 22.938 |
| 0.8067476851851851 | 22.375 |
| 0.8067708333333333 | 22.312 |
| 0.8069328703703703 | 21.812 |
| 0.8071990740740741 | 21.25 |
| 0.807511574074074 | 21.125 |
| 0.8081597222222222 | 21.875 |
| 0.8082291666666667 | 22.312 |
| 0.8082638888888889 | 22.438 |
| 0.8083564814814815 | 23.062 |
| 0.8084606481481482 | 23.625 |
| 0.8085416666666667 | 24.188 |
| 0.8086574074074074 | 24.75 |
| 0.8090162037037038 | 24.625 |
| 0.8091319444444444 | 24.188 |
| 0.8092592592592592 | 23.625 |
| 0.8094097222222222 | 23.062 |
| 0.8095601851851852 | 22.5 |
| 0.8097800925925926 | 22.125 |
| 0.8098726851851853 | 21.938 |
| 0.8101041666666666 | 21.375 |
| 0.810324074074074 | 20.812 |
| 0.8105324074074075 | 20.438 |
| 0.8106944444444445 | 20.25 |
| 0.8112615740740741 | 20.125 |
| 0.8119791666666667 | 20.188 |
| 0.8126851851851852 | 20.375 |
| 0.8134027777777778 | 20 |
| 0.8141087962962964 | 19.812 |
| 0.8148263888888888 | 20.125 |
| 0.8155324074074074 | 20.25 |
| 0.81625 | 19.812 |
| 0.8164236111111111 | 19.688 |
| 0.8169675925925927 | 19.562 |
| 0.8176851851851853 | 19.5 |
| 0.8183912037037038 | 19.562 |
| 0.8191087962962963 | 19.438 |
| 0.8198148148148148 | 19.438 |
| 0.8205324074074074 | 19.75 |
| 0.8212384259259259 | 19.625 |
| 0.8219560185185185 | 19.5 |
| 0.8226620370370371 | 19.375 |
| 0.8233796296296297 | 19.312 |
| 0.8240856481481481 | 19.25 |
| 0.8248032407407407 | 19.312 |
| 0.8255092592592592 | 19.312 |
| 0.8262268518518519 | 19.375 |
| 0.8269328703703703 | 19.562 |
| 0.827650462962963 | 20.125 |
| 0.8280208333333333 | 20.25 |
| 0.8283796296296296 | 20.125 |
| 0.8290856481481481 | 20 |
| 0.8295717592592592 | 19.688 |
| 0.8298148148148149 | 19.625 |
| 0.8305208333333334 | 19.938 |
| 0.8308217592592593 | 20.25 |
| 0.8310185185185185 | 20.812 |
| 0.8312615740740741 | 21.125 |
| 0.8316319444444445 | 21.375 |
| 0.8319907407407406 | 21.438 |
| 0.832210648148148 | 21.938 |
| 0.8323726851851853 | 22.5 |
| 0.8325231481481481 | 23.062 |
| 0.8326736111111112 | 23.625 |
| 0.8327546296296297 | 23.812 |
| 0.8328935185185186 | 24.188 |
| 0.8334837962962963 | 24.625 |
| 0.8338425925925925 | 23.625 |
| 0.8339814814814814 | 23.062 |
| 0.8341319444444445 | 22.5 |
| 0.8342361111111112 | 22.25 |
| 0.8343402777777778 | 21.938 |
| 0.8345833333333333 | 21.375 |
| 0.8349768518518519 | 21.125 |
| 0.8352662037037036 | 20.812 |
| 0.8357060185185184 | 20.688 |
| 0.8362152777777778 | 20.25 |
| 0.8364351851851852 | 20.125 |
| 0.8371412037037037 | 20.125 |
| 0.837824074074074 | 20.812 |
| 0.8378703703703704 | 21 |
| 0.8379976851851851 | 21.375 |
| 0.8382291666666667 | 21.938 |
| 0.8386111111111111 | 22.062 |
| 0.8389814814814814 | 21.375 |
| 0.8393402777777778 | 20.938 |
| 0.8394212962962962 | 20.812 |
| 0.8399189814814815 | 20.25 |
| 0.8400810185185185 | 20.125 |
| 0.840787037037037 | 20.125 |
| 0.841099537037037 | 20.812 |
| 0.8415162037037037 | 21.188 |
| 0.8422222222222223 | 20.562 |
| 0.8424768518518518 | 20.25 |
| 0.8429513888888889 | 19.812 |
| 0.8430555555555556 | 19.688 |
| 0.8436805555555557 | 19.375 |
| 0.8443865740740741 | 19.375 |
| 0.8451041666666667 | 19.312 |
| 0.8458101851851851 | 19.438 |
| 0.8465277777777778 | 19.5 |
| 0.8472337962962962 | 19.375 |
| 0.8479513888888889 | 19.438 |
| 0.8486574074074075 | 19.688 |
| 0.8493750000000001 | 19.375 |
| 0.8500810185185186 | 19.188 |
| 0.8507986111111111 | 19.375 |
| 0.8513425925925926 | 19.125 |
| 0.8515277777777778 | 19.125 |
| 0.8522337962962964 | 19.062 |
| 0.852951388888889 | 18.875 |
| 0.8536574074074075 | 18.938 |
| 0.854375 | 18.875 |
| 0.8550810185185185 | 18.75 |
| 0.8557986111111111 | 18.75 |
| 0.8565046296296296 | 19.062 |
| 0.8572222222222222 | 19.062 |
| 0.8579282407407408 | 18.812 |
| 0.8586458333333334 | 18.625 |
| 0.8590509259259259 | 18.562 |
| 0.8593634259259259 | 18.625 |
| 0.8600810185185185 | 18.688 |
| 0.8607870370370371 | 18.875 |
| 0.8610300925925927 | 19.125 |
| 0.8615162037037036 | 19.375 |
| 0.8622222222222223 | 19.25 |
| 0.8629398148148147 | 18.875 |
| 0.8636458333333333 | 19 |
| 0.864363425925926 | 19.062 |
| 0.8650694444444444 | 19.312 |
| 0.8657870370370371 | 19.188 |
| 0.8664930555555556 | 19.188 |
| 0.8672106481481481 | 18.875 |
| 0.8679166666666666 | 18.688 |
| 0.8685879629629629 | 18.562 |
| 0.8686458333333333 | 18.625 |
| 0.869363425925926 | 18.562 |
| 0.8700694444444445 | 18.625 |
| 0.870787037037037 | 18.625 |
| 0.8714930555555555 | 18.438 |
| 0.8722106481481481 | 18.25 |
| 0.8729166666666667 | 18.25 |
| 0.8736342592592593 | 18.438 |
| 0.8743402777777778 | 18.375 |
| 0.8750578703703704 | 18.188 |
| 0.8757638888888889 | 18.188 |
| 0.8761574074074074 | 18 |
| 0.8764930555555556 | 18 |
| 0.877199074074074 | 18 |
| 0.8779166666666667 | 17.75 |
| 0.8787731481481482 | 18.062 |
| 0.8794907407407407 | 17.938 |
| 0.8801967592592592 | 18.188 |
| 0.8809143518518519 | 18.312 |
| 0.8816203703703703 | 18.062 |
| 0.882337962962963 | 18.188 |
| 0.8830439814814816 | 18.5 |
| 0.883125 | 18.562 |
| 0.8837731481481481 | 18.438 |
| 0.8844907407407407 | 18.438 |
| 0.8851967592592592 | 18.312 |
| 0.8859143518518519 | 18.188 |
| 0.88625 | 18 |
| 0.8866319444444444 | 17.688 |
| 0.887349537037037 | 17.625 |
| 0.8880555555555555 | 17.875 |
| 0.8887731481481481 | 17.688 |
| 0.8894791666666667 | 18.188 |
| 0.8901967592592593 | 18.062 |
| 0.8909027777777778 | 17.938 |
| 0.8916203703703703 | 17.938 |
| 0.8923263888888888 | 18.062 |
| 0.8930439814814815 | 18 |
| 0.8937499999999999 | 17.938 |
| 0.8944675925925926 | 17.875 |
| 0.8951736111111112 | 17.625 |
| 0.895949074074074 | 17.812 |
| 0.8966666666666666 | 17.812 |
| 0.8973726851851852 | 17.562 |
| 0.8980902777777778 | 17.625 |
| 0.8987962962962963 | 17.5 |
| 0.8989930555555555 | 17.438 |
| 0.8995254629629629 | 17.25 |
| 0.9002430555555555 | 17.312 |
| 0.9009490740740741 | 17.438 |
| 0.9016666666666667 | 17.125 |
| 0.9021064814814815 | 16.875 |
| 0.9023842592592594 | 16.812 |
| 0.9031018518518518 | 16.812 |
| 0.9038078703703704 | 16.75 |
| 0.904525462962963 | 16.5 |
| 0.9052314814814815 | 16.375 |
| 0.9053356481481482 | 16.312 |
| 0.9059606481481483 | 16.188 |
| 0.9066782407407407 | 16.062 |
| 0.9075810185185186 | 15.938 |
| 0.9082870370370371 | 15.938 |
| 0.9090046296296297 | 15.938 |
| 0.9097106481481482 | 15.875 |
| 0.9104282407407407 | 15.875 |
| 0.9110532407407407 | 15.75 |
| 0.9111574074074075 | 15.75 |
| 0.911863425925926 | 15.688 |
| 0.9125810185185186 | 15.625 |
| 0.9132870370370371 | 15.562 |
| 0.9140046296296296 | 15.562 |
| 0.9147106481481481 | 15.5 |
| 0.9154282407407407 | 15.438 |
| 0.9161342592592593 | 15.562 |
| 0.9168518518518519 | 15.5 |
| 0.9175578703703704 | 15.375 |
| 0.918275462962963 | 15.25 |
| 0.9186342592592592 | 15.188 |
| 0.9189930555555555 | 15.188 |
| 0.9197106481481482 | 15.125 |
| 0.9204282407407408 | 15.125 |
| 0.9211342592592593 | 15.062 |
| 0.9218518518518519 | 15.125 |
| 0.9225578703703704 | 15.188 |
| 0.9232754629629629 | 15.125 |
| 0.9239814814814814 | 15.125 |
| 0.924699074074074 | 15.188 |
| 0.9254050925925926 | 15.188 |
| 0.9261226851851853 | 15.25 |
| 0.9269791666666666 | 15.25 |
| 0.9275925925925925 | 15.75 |
| 0.9277083333333334 | 15.875 |
| 0.9284143518518518 | 15.938 |
| 0.9287615740740741 | 16.312 |
| 0.9291435185185185 | 16.25 |
| 0.9298611111111111 | 16.375 |
| 0.9305671296296296 | 16.188 |
| 0.9312847222222222 | 15.875 |
| 0.9316319444444444 | 15.75 |
| 0.9320023148148149 | 15.812 |
| 0.9327199074074074 | 15.688 |
| 0.9334375 | 15.688 |
| 0.9341435185185185 | 15.688 |
| 0.9348611111111111 | 15.688 |
| 0.9355671296296296 | 15.75 |
| 0.9362731481481482 | 15.812 |
| 0.9369907407407408 | 15.812 |
| 0.9377083333333333 | 15.875 |
| 0.9384143518518518 | 15.875 |
| 0.9391203703703703 | 15.875 |
| 0.939837962962963 | 15.688 |
| 0.9405555555555556 | 15.562 |
| 0.9412615740740741 | 15.312 |
| 0.9419791666666667 | 15.375 |
| 0.9426736111111111 | 15.188 |
| 0.9426967592592592 | 15.25 |
| 0.9434143518518519 | 15.125 |
| 0.944363425925926 | 15.188 |
| 0.9450694444444444 | 15.125 |
| 0.945787037037037 | 15 |
| 0.9465046296296297 | 14.938 |
| 0.9472106481481481 | 15 |
| 0.9479282407407408 | 14.938 |
| 0.9486342592592593 | 14.938 |
| 0.9493518518518519 | 14.938 |
| 0.9501273148148148 | 14.938 |
| 0.9508333333333333 | 14.875 |
| 0.9516550925925925 | 14.938 |
| 0.9523611111111111 | 14.938 |
| 0.9530787037037037 | 14.875 |
| 0.9537847222222222 | 14.875 |
| 0.9545023148148148 | 14.938 |
| 0.9552083333333333 | 14.875 |
| 0.955925925925926 | 15 |
| 0.9566319444444445 | 14.938 |
| 0.957349537037037 | 14.875 |
| 0.9580555555555555 | 15 |
| 0.9588425925925925 | 14.875 |
| 0.9595601851851852 | 14.875 |
| 0.9602662037037036 | 14.812 |
| 0.9609837962962963 | 14.812 |
| 0.9616898148148149 | 14.875 |
| 0.9624074074074075 | 14.812 |
| 0.963113425925926 | 14.688 |
| 0.9638310185185185 | 14.688 |
| 0.9644328703703704 | 14.625 |
| 0.9645601851851852 | 14.688 |
| 0.9654629629629629 | 14.625 |
| 0.9661805555555555 | 14.625 |
| 0.9668981481481481 | 14.625 |
| 0.9676041666666667 | 14.688 |
| 0.9683217592592593 | 14.688 |
| 0.9690277777777778 | 14.75 |
| 0.9697453703703703 | 14.688 |
| 0.9704513888888888 | 14.75 |
| 0.9711689814814815 | 14.75 |
| 0.9718749999999999 | 14.75 |
| 0.9725925925925926 | 14.688 |
| 0.9732986111111112 | 14.688 |
| 0.9740162037037038 | 14.688 |
| 0.9747222222222223 | 14.625 |
| 0.9754398148148148 | 14.75 |
| 0.9761458333333333 | 14.562 |
| 0.9770023148148148 | 14.562 |
| 0.9777199074074074 | 14.562 |
| 0.9784375000000001 | 14.562 |
| 0.9791435185185186 | 14.5 |
| 0.9798611111111111 | 14.562 |
| 0.9805671296296296 | 14.5 |
| 0.9812847222222222 | 14.5 |
| 0.9819907407407408 | 14.688 |
| 0.9827083333333334 | 14.625 |
| 0.9834143518518519 | 14.562 |
| 0.9841319444444444 | 14.562 |
| 0.984837962962963 | 14.5 |
| 0.9855555555555555 | 14.438 |
| 0.986261574074074 | 14.438 |
| 0.9869791666666666 | 14.438 |
| 0.9877893518518519 | 14.375 |
| 0.9884953703703704 | 14.375 |
| 0.9892476851851852 | 14.375 |
| 0.9899537037037037 | 14.375 |
| 0.9907638888888889 | 14.375 |
| 0.9914699074074074 | 14.375 |
| 0.9922453703703704 | 14.312 |
| 0.9931597222222223 | 14.312 |
| 0.9938773148148149 | 14.25 |
| 0.9945833333333334 | 14.188 |
| 0.9953009259259259 | 14.312 |
| 0.9960069444444444 | 14.125 |
| 0.996724537037037 | 14.125 |
| 0.9971527777777777 | 14.062 |
| 0.9976504629629629 | 14.188 |
| 0.9985648148148147 | 14 |
| 0.9992824074074074 | 13.875 |
| 0.9999884259259259 | 13.812 |